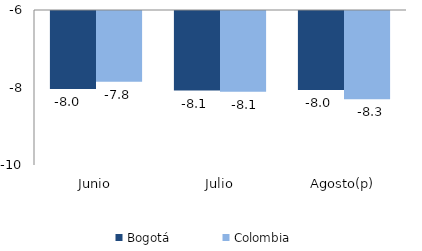
| Category | Bogotá | Colombia |
|---|---|---|
| Junio | -8.013 | -7.825 |
| Julio | -8.054 | -8.082 |
| Agosto(p) | -8.037 | -8.278 |